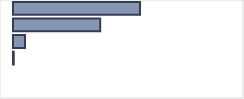
| Category | Series 0 |
|---|---|
| 0 | 55.94 |
| 1 | 38.415 |
| 2 | 5.323 |
| 3 | 0.322 |
| 4 | 0 |